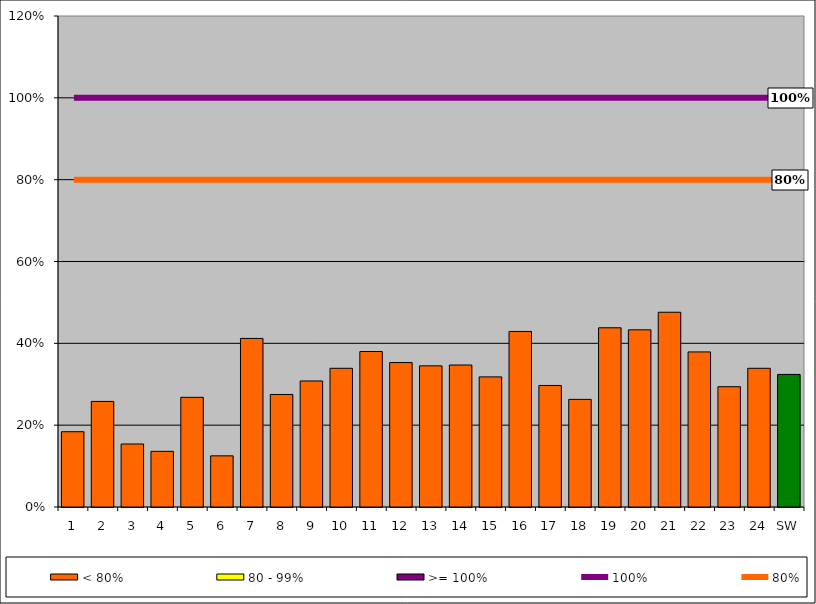
| Category | < 80% | 80 - 99% | >= 100% |
|---|---|---|---|
| 1 | 0.184 | 0 | 0 |
| 2 | 0.258 | 0 | 0 |
| 3 | 0.154 | 0 | 0 |
| 4 | 0.136 | 0 | 0 |
| 5 | 0.268 | 0 | 0 |
| 6 | 0.125 | 0 | 0 |
| 7 | 0.412 | 0 | 0 |
| 8 | 0.275 | 0 | 0 |
| 9 | 0.308 | 0 | 0 |
| 10 | 0.339 | 0 | 0 |
| 11 | 0.38 | 0 | 0 |
| 12 | 0.353 | 0 | 0 |
| 13 | 0.345 | 0 | 0 |
| 14 | 0.347 | 0 | 0 |
| 15 | 0.318 | 0 | 0 |
| 16 | 0.429 | 0 | 0 |
| 17 | 0.297 | 0 | 0 |
| 18 | 0.263 | 0 | 0 |
| 19 | 0.438 | 0 | 0 |
| 20 | 0.433 | 0 | 0 |
| 21 | 0.476 | 0 | 0 |
| 22 | 0.379 | 0 | 0 |
| 23 | 0.294 | 0 | 0 |
| 24 | 0.339 | 0 | 0 |
| SW | 0.324 | 0 | 0 |